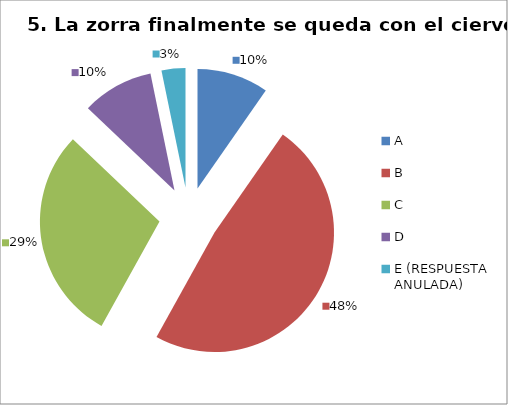
| Category | CANTIDAD DE RESPUESTAS PREGUNTA (5) | PORCENTAJE |
|---|---|---|
| A | 3 | 0.097 |
| B | 15 | 0.484 |
| C | 9 | 0.29 |
| D | 3 | 0.097 |
| E (RESPUESTA ANULADA) | 1 | 0.032 |